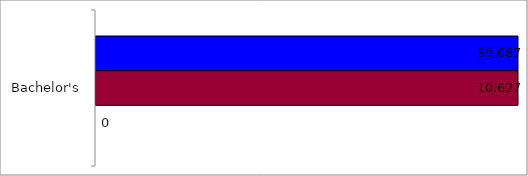
| Category | 50 states and D.C. | SREB states | State |
|---|---|---|---|
| Bachelor's | 39687 | 10627 | 0 |